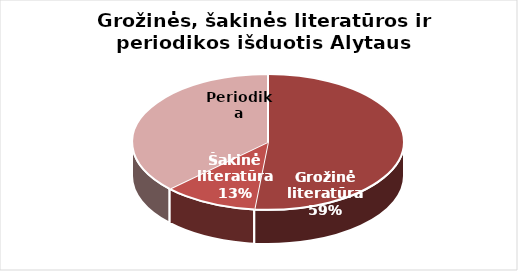
| Category | Series 0 |
|---|---|
| Grožinė literatūra | 380808 |
| Šakinė literatūra | 83069 |
| Periodika | 274067 |